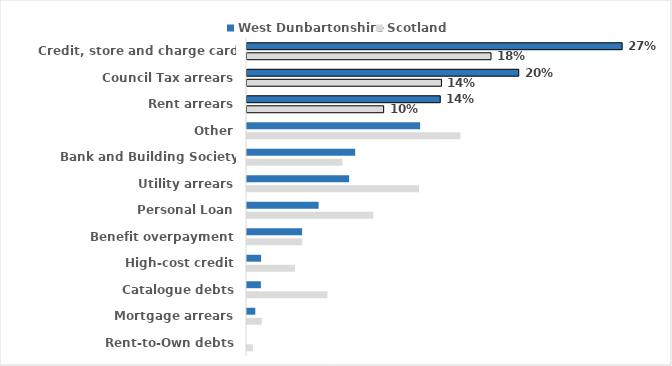
| Category | West Dunbartonshire | Scotland |
|---|---|---|
| Credit, store and charge card debts | 0.271 | 0.176 |
| Council Tax arrears | 0.196 | 0.14 |
| Rent arrears | 0.139 | 0.099 |
| Other | 0.125 | 0.154 |
| Bank and Building Society overdrafts | 0.078 | 0.069 |
| Utility arrears | 0.074 | 0.124 |
| Personal Loan | 0.052 | 0.091 |
| Benefit overpayment | 0.04 | 0.04 |
| High-cost credit | 0.01 | 0.035 |
| Catalogue debts | 0.01 | 0.058 |
| Mortgage arrears | 0.006 | 0.011 |
| Rent-to-Own debts | 0 | 0.004 |